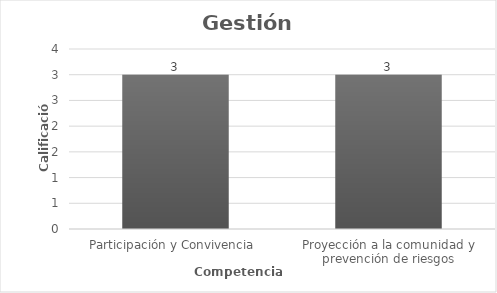
| Category | Series 0 |
|---|---|
| Participación y Convivencia  | 3 |
| Proyección a la comunidad y prevención de riesgos | 3 |